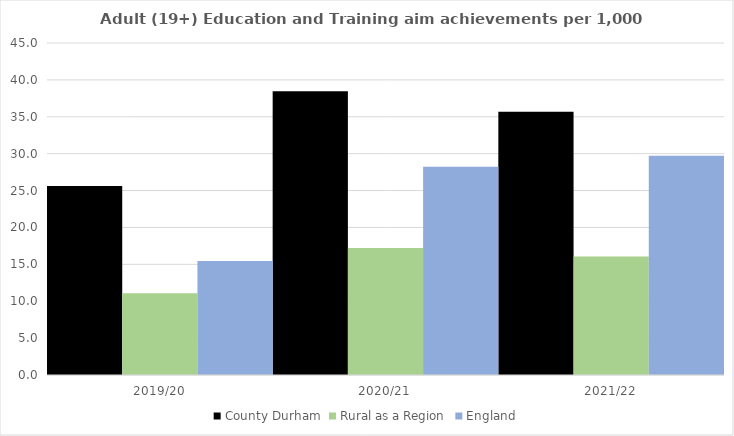
| Category | County Durham | Rural as a Region | England |
|---|---|---|---|
| 2019/20 | 25.628 | 11.081 | 15.446 |
| 2020/21 | 38.476 | 17.224 | 28.211 |
| 2021/22 | 35.683 | 16.063 | 29.711 |